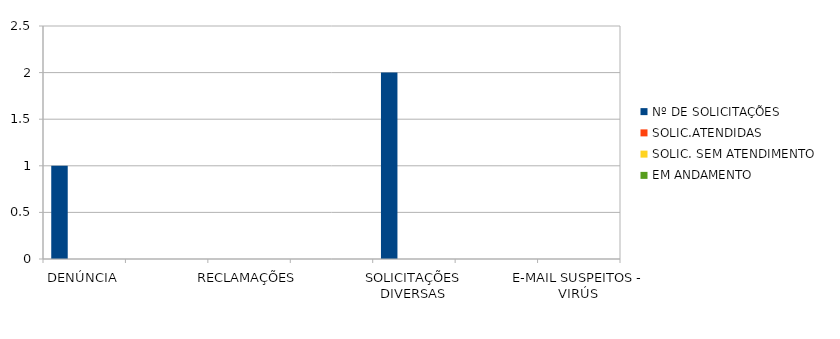
| Category | Nº DE SOLICITAÇÕES | SOLIC.ATENDIDAS | SOLIC. SEM ATENDIMENTO | EM ANDAMENTO |
|---|---|---|---|---|
| DENÚNCIA | 1 | 0 | 0 | 0 |
| DÚVIDA | 0 | 0 | 0 | 0 |
| RECLAMAÇÕES | 0 | 0 | 0 | 0 |
| PEDIDO DE ACESSO À INFORMAÇÃO | 0 | 0 | 0 | 0 |
| SOLICITAÇÕES DIVERSAS | 2 | 0 | 0 | 0 |
| SUGESTÃO  | 0 | 0 | 0 | 0 |
| E-MAIL SUSPEITOS - VIRÚS | 0 | 0 | 0 | 0 |